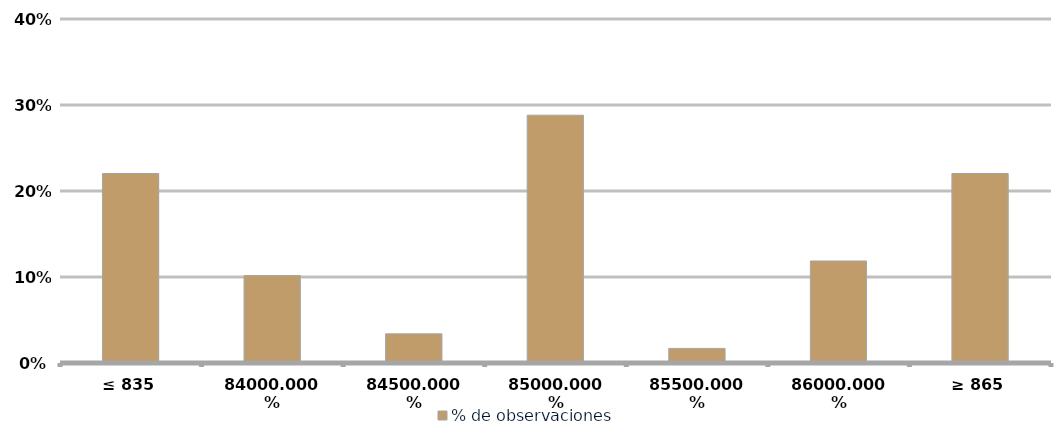
| Category | % de observaciones  |
|---|---|
| ≤ 835 | 0.22 |
| 840 | 0.102 |
| 845 | 0.034 |
| 850 | 0.288 |
| 855 | 0.017 |
| 860 | 0.119 |
| ≥ 865 | 0.22 |